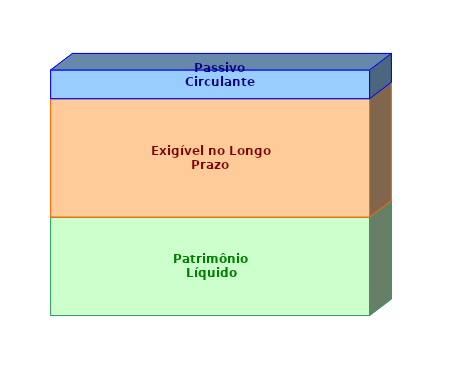
| Category | Patrimônio Líquido | Exigível no Longo Prazo | Passivo Circulante |
|---|---|---|---|
| 0 | 0.401 | 0.482 | 0.117 |